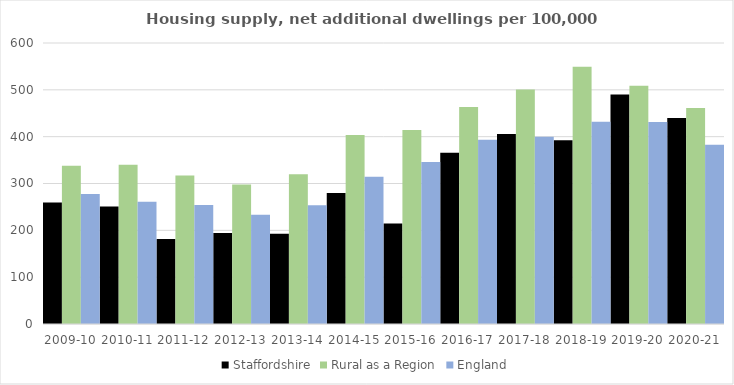
| Category | Staffordshire | Rural as a Region | England |
|---|---|---|---|
| 2009-10 | 259.23 | 337.852 | 277.548 |
| 2010-11 | 251.003 | 340.105 | 260.994 |
| 2011-12 | 181.702 | 317.04 | 254.007 |
| 2012-13 | 194.123 | 297.763 | 233.153 |
| 2013-14 | 192.452 | 319.835 | 253.602 |
| 2014-15 | 279.81 | 403.796 | 314.256 |
| 2015-16 | 214.808 | 414.091 | 346.154 |
| 2016-17 | 365.407 | 463.209 | 393.256 |
| 2017-18 | 405.592 | 500.68 | 399.646 |
| 2018-19 | 392.13 | 549.491 | 432.099 |
| 2019-20 | 490.018 | 508.493 | 431.187 |
| 2020-21 | 439.665 | 461.114 | 382.827 |